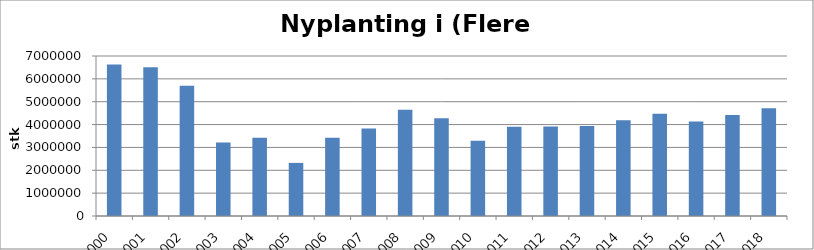
| Category | Totalt |
|---|---|
| 2000 | 6630854 |
| 2001 | 6502382 |
| 2002 | 5695462 |
| 2003 | 3213931 |
| 2004 | 3424886 |
| 2005 | 2324251 |
| 2006 | 3425299 |
| 2007 | 3825357 |
| 2008 | 4645036 |
| 2009 | 4274842 |
| 2010 | 3289257 |
| 2011 | 3904974 |
| 2012 | 3917214 |
| 2013 | 3937117 |
| 2014 | 4191889 |
| 2015 | 4478707 |
| 2016 | 4138987 |
| 2017 | 4422882 |
| 2018 | 4718225 |